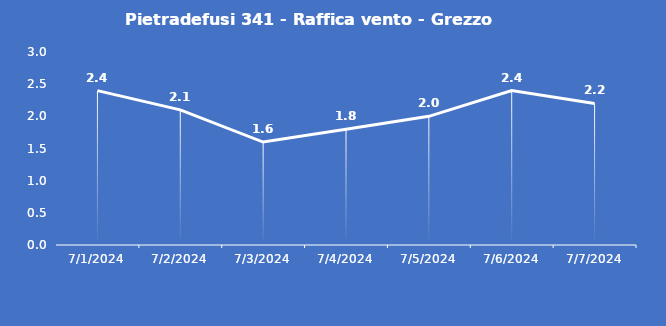
| Category | Pietradefusi 341 - Raffica vento - Grezzo (m/s) |
|---|---|
| 7/1/24 | 2.4 |
| 7/2/24 | 2.1 |
| 7/3/24 | 1.6 |
| 7/4/24 | 1.8 |
| 7/5/24 | 2 |
| 7/6/24 | 2.4 |
| 7/7/24 | 2.2 |